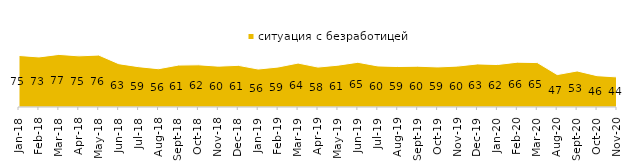
| Category | ситуация с безработицей |
|---|---|
| 2018-01-01 | 75.4 |
| 2018-02-01 | 73.25 |
| 2018-03-01 | 76.95 |
| 2018-04-01 | 74.85 |
| 2018-05-01 | 76 |
| 2018-06-01 | 63.4 |
| 2018-07-01 | 59 |
| 2018-08-01 | 56 |
| 2018-09-01 | 61.35 |
| 2018-10-01 | 61.75 |
| 2018-11-01 | 59.78 |
| 2018-12-01 | 60.95 |
| 2019-01-01 | 55.55 |
| 2019-02-01 | 58.5 |
| 2019-03-01 | 64.296 |
| 2019-04-01 | 58.416 |
| 2019-05-01 | 61.169 |
| 2019-06-01 | 65.436 |
| 2019-07-01 | 60.099 |
| 2019-08-01 | 59.241 |
| 2019-09-01 | 59.703 |
| 2019-10-01 | 58.614 |
| 2019-11-01 | 59.851 |
| 2019-12-01 | 63.02 |
| 2020-01-01 | 62.129 |
| 2020-02-01 | 65.594 |
| 2020-03-01 | 64.998 |
| 2020-08-01 | 47.418 |
| 2020-09-01 | 52.763 |
| 2020-10-01 | 45.84 |
| 2020-11-01 | 44 |